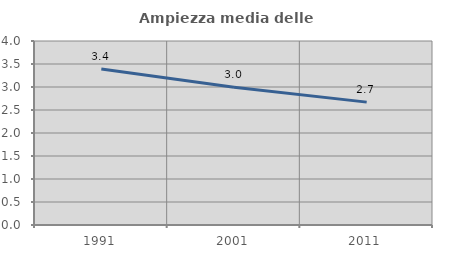
| Category | Ampiezza media delle famiglie |
|---|---|
| 1991.0 | 3.392 |
| 2001.0 | 2.995 |
| 2011.0 | 2.671 |